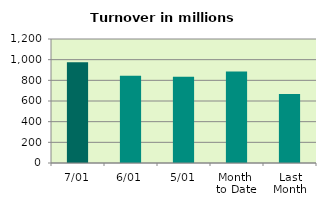
| Category | Series 0 |
|---|---|
| 7/01 | 975.489 |
| 6/01 | 844.759 |
| 5/01 | 834.388 |
| Month 
to Date | 886.613 |
| Last
Month | 667.375 |